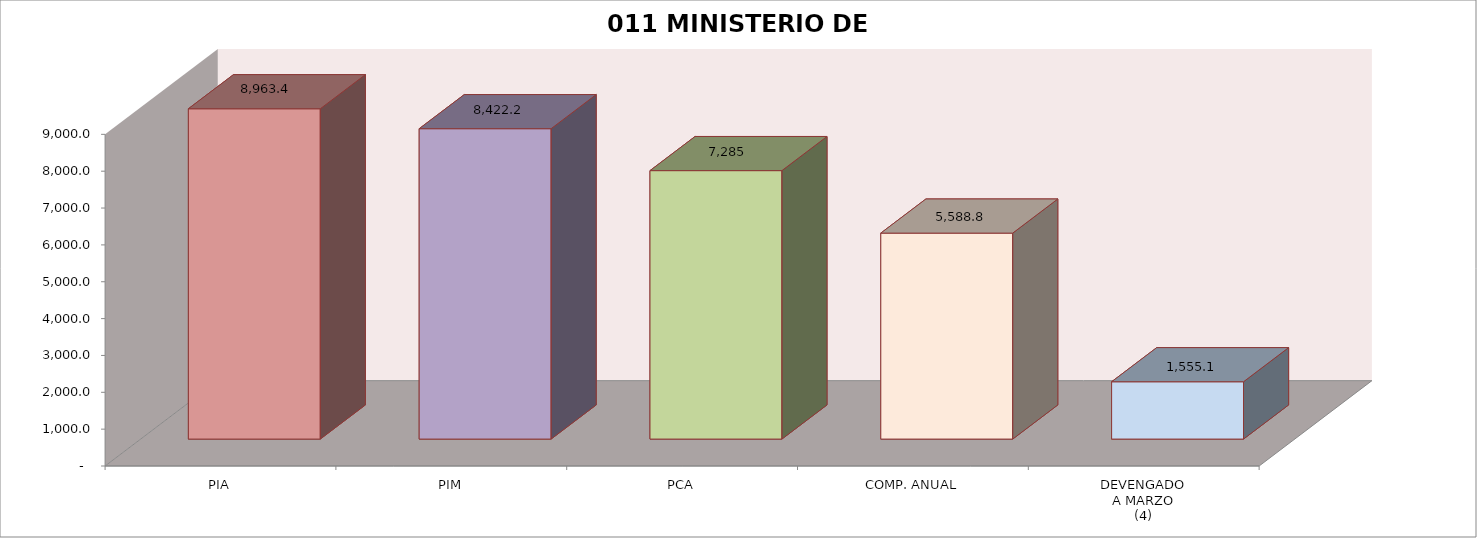
| Category | 011 MINISTERIO DE SALUD |
|---|---|
| PIA | 8963.39 |
| PIM | 8422.208 |
| PCA | 7284.659 |
| COMP. ANUAL | 5588.806 |
| DEVENGADO
A MARZO
(4) | 1555.125 |